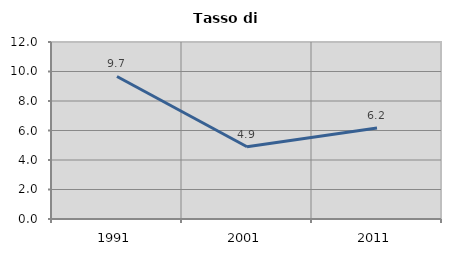
| Category | Tasso di disoccupazione   |
|---|---|
| 1991.0 | 9.662 |
| 2001.0 | 4.897 |
| 2011.0 | 6.173 |